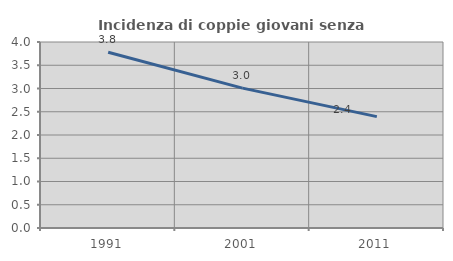
| Category | Incidenza di coppie giovani senza figli |
|---|---|
| 1991.0 | 3.779 |
| 2001.0 | 3.008 |
| 2011.0 | 2.395 |